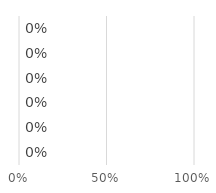
| Category | Series 0 |
|---|---|
| Flights | 0 |
| Accommodation | 0 |
| Food | 0 |
| Transportation | 0 |
| Attractions | 0 |
| Others | 0 |